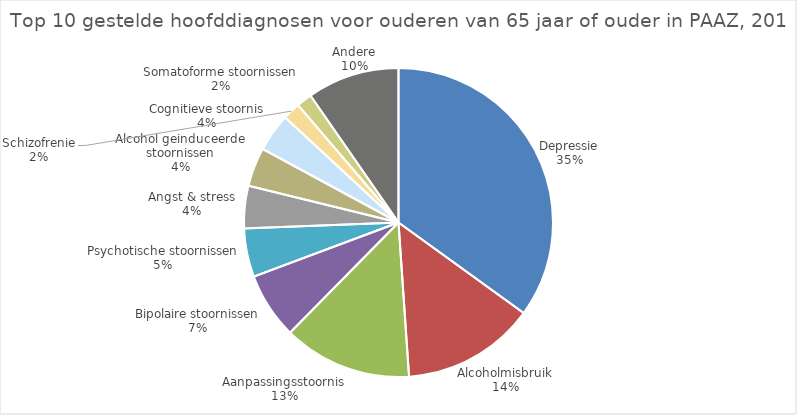
| Category | Series 0 |
|---|---|
| Depressie | 1670 |
| Alcoholmisbruik | 666 |
| Aanpassingsstoornis | 643 |
| Bipolaire stoornissen | 331 |
| Psychotische stoornissen | 243 |
| Angst & stress | 212 |
| Alcohol geinduceerde stoornissen | 194 |
| Cognitieve stoornis | 191 |
| Schizofrenie | 88 |
| Somatoforme stoornissen | 77 |
| Andere | 461 |